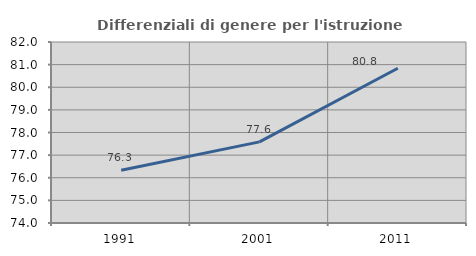
| Category | Differenziali di genere per l'istruzione superiore |
|---|---|
| 1991.0 | 76.335 |
| 2001.0 | 77.587 |
| 2011.0 | 80.84 |